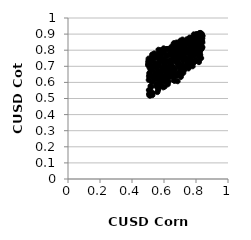
| Category | Series 0 |
|---|---|
| 0.789537141163253 | 0.803 |
| 0.7393209278989524 | 0.742 |
| 0.5146972384262045 | 0.66 |
| 0.8025821466182872 | 0.869 |
| 0.7553423103545773 | 0.871 |
| 0.6518374552992151 | 0.783 |
| 0.716653761533334 | 0.678 |
| 0.7913280189907017 | 0.766 |
| 0.5979593884945443 | 0.812 |
| 0.6924302068703907 | 0.796 |
| 0.6721062809417795 | 0.773 |
| 0.6343633907560136 | 0.633 |
| 0.7126194483507063 | 0.855 |
| 0.5954020792871302 | 0.569 |
| 0.7838053251334289 | 0.764 |
| 0.5831548302153797 | 0.656 |
| 0.6665365841519753 | 0.609 |
| 0.5408568572932027 | 0.663 |
| 0.7822607365205054 | 0.847 |
| 0.5972532858750963 | 0.71 |
| 0.5687135410672672 | 0.594 |
| 0.8086954234759687 | 0.868 |
| 0.6833786474103468 | 0.65 |
| 0.575823483311674 | 0.575 |
| 0.7512775900678096 | 0.84 |
| 0.5157013543859263 | 0.578 |
| 0.6257720732143637 | 0.684 |
| 0.6489855045192885 | 0.694 |
| 0.6496880024415178 | 0.791 |
| 0.643625241038317 | 0.712 |
| 0.8337201559222865 | 0.814 |
| 0.7409492055369735 | 0.717 |
| 0.6217054554742861 | 0.673 |
| 0.7963768174862137 | 0.882 |
| 0.7535535987557852 | 0.694 |
| 0.6586420130550489 | 0.633 |
| 0.807680028695077 | 0.88 |
| 0.7996050523855961 | 0.877 |
| 0.5791963725857388 | 0.661 |
| 0.7899514284050327 | 0.728 |
| 0.6170863241183342 | 0.805 |
| 0.696999464018413 | 0.647 |
| 0.8108554417359185 | 0.84 |
| 0.5592521472254736 | 0.54 |
| 0.673407103201527 | 0.727 |
| 0.6364854366401308 | 0.652 |
| 0.8019023742772847 | 0.867 |
| 0.7017172402778769 | 0.806 |
| 0.682590820111384 | 0.736 |
| 0.8255507794949901 | 0.764 |
| 0.7270235156668525 | 0.82 |
| 0.5835508032848437 | 0.691 |
| 0.5480344765651697 | 0.633 |
| 0.590976132361733 | 0.628 |
| 0.5080178996267478 | 0.52 |
| 0.5213319708328319 | 0.747 |
| 0.5585170846697625 | 0.758 |
| 0.727219435900885 | 0.829 |
| 0.8247338158405075 | 0.88 |
| 0.6407434502436964 | 0.705 |
| 0.7399629861713787 | 0.809 |
| 0.8203378696219645 | 0.829 |
| 0.5749204074095717 | 0.669 |
| 0.6471009726955761 | 0.823 |
| 0.5258403186809127 | 0.773 |
| 0.6884872854444603 | 0.807 |
| 0.7778725840772602 | 0.862 |
| 0.7719403527171453 | 0.839 |
| 0.7857166333493164 | 0.876 |
| 0.6579228734268394 | 0.775 |
| 0.7614068246514567 | 0.754 |
| 0.6230047715944955 | 0.724 |
| 0.7730864565297618 | 0.776 |
| 0.7591578467960547 | 0.826 |
| 0.6450855435140814 | 0.773 |
| 0.6286691533007386 | 0.604 |
| 0.747986817526133 | 0.739 |
| 0.7959635419356264 | 0.732 |
| 0.5195048153118826 | 0.572 |
| 0.5660370532559245 | 0.579 |
| 0.5093421625427896 | 0.646 |
| 0.7877308143223478 | 0.877 |
| 0.5674634064427115 | 0.619 |
| 0.5613703026136772 | 0.662 |
| 0.5719420304504657 | 0.754 |
| 0.5675779671727499 | 0.709 |
| 0.8322778754209412 | 0.804 |
| 0.5765796773158051 | 0.647 |
| 0.6253366417877969 | 0.64 |
| 0.7154265294037168 | 0.866 |
| 0.5016962133848333 | 0.726 |
| 0.7712719926138032 | 0.743 |
| 0.7572323442549609 | 0.836 |
| 0.8345911046278203 | 0.894 |
| 0.5860378547236758 | 0.749 |
| 0.8224486327946388 | 0.809 |
| 0.6418075506634328 | 0.793 |
| 0.724220812300675 | 0.77 |
| 0.6787454511188613 | 0.755 |
| 0.7333125306797498 | 0.742 |
| 0.5228472771427579 | 0.753 |
| 0.6760243627180262 | 0.785 |
| 0.543372627101915 | 0.713 |
| 0.7576616174536694 | 0.728 |
| 0.713827252726047 | 0.799 |
| 0.6300923187554525 | 0.676 |
| 0.7904861337532192 | 0.88 |
| 0.7247234132525657 | 0.677 |
| 0.6359512200970323 | 0.684 |
| 0.5555859263387691 | 0.62 |
| 0.6768518473513807 | 0.758 |
| 0.7632916115194517 | 0.711 |
| 0.8361713561107815 | 0.853 |
| 0.7186095118210329 | 0.851 |
| 0.7826198001580864 | 0.817 |
| 0.5738240237371401 | 0.766 |
| 0.522229076433828 | 0.731 |
| 0.7436753682812365 | 0.839 |
| 0.5694467603981398 | 0.573 |
| 0.5233217223801523 | 0.605 |
| 0.6055794496710558 | 0.636 |
| 0.8259875826886454 | 0.898 |
| 0.5546883763017978 | 0.685 |
| 0.6970743407092577 | 0.703 |
| 0.7566165155017609 | 0.864 |
| 0.7992659975486164 | 0.739 |
| 0.7196651382184569 | 0.804 |
| 0.8271957800808887 | 0.886 |
| 0.6426070367800769 | 0.669 |
| 0.6394822772287416 | 0.714 |
| 0.7626421155655152 | 0.719 |
| 0.734411382934531 | 0.781 |
| 0.5534244408105516 | 0.692 |
| 0.8281919239707146 | 0.866 |
| 0.7088443723876972 | 0.665 |
| 0.8199861684290868 | 0.84 |
| 0.6401429103923447 | 0.738 |
| 0.7025045353921959 | 0.751 |
| 0.746728014880554 | 0.712 |
| 0.7581663571935776 | 0.72 |
| 0.7507911358505414 | 0.706 |
| 0.6372755305705395 | 0.811 |
| 0.7173810607794494 | 0.734 |
| 0.7935086587236646 | 0.73 |
| 0.7149317985403314 | 0.667 |
| 0.6154269675054836 | 0.769 |
| 0.7361277163643768 | 0.808 |
| 0.6131144084233837 | 0.662 |
| 0.5302334103463762 | 0.674 |
| 0.6282488273001341 | 0.732 |
| 0.6099894606985351 | 0.771 |
| 0.5708010144974307 | 0.728 |
| 0.5125394888278862 | 0.71 |
| 0.7178824865773556 | 0.707 |
| 0.6449624632456418 | 0.654 |
| 0.677701555558522 | 0.848 |
| 0.7886346470031298 | 0.729 |
| 0.501015685375253 | 0.706 |
| 0.7659417452105861 | 0.744 |
| 0.8004567309422825 | 0.861 |
| 0.5043896243421815 | 0.615 |
| 0.7761600594016458 | 0.876 |
| 0.6982249758776872 | 0.706 |
| 0.7770443676625121 | 0.803 |
| 0.5823176648096522 | 0.648 |
| 0.5293232185321834 | 0.743 |
| 0.6623106509693579 | 0.779 |
| 0.8365377168351142 | 0.811 |
| 0.5500247197642468 | 0.63 |
| 0.8404298894487359 | 0.818 |
| 0.8302343059578688 | 0.831 |
| 0.7280562744120243 | 0.806 |
| 0.7052163806409246 | 0.633 |
| 0.5883584156752549 | 0.578 |
| 0.814812190026081 | 0.78 |
| 0.7849867627304555 | 0.787 |
| 0.5396863462382026 | 0.71 |
| 0.6609840372955875 | 0.843 |
| 0.7225769808817138 | 0.754 |
| 0.6615694642950851 | 0.737 |
| 0.7804333124404206 | 0.731 |
| 0.6707992627941833 | 0.827 |
| 0.5102409027126322 | 0.69 |
| 0.7690451302396976 | 0.875 |
| 0.7619484803774603 | 0.859 |
| 0.6378902395056195 | 0.727 |
| 0.5511583664545938 | 0.704 |
| 0.6271628713404449 | 0.657 |
| 0.7670833033895674 | 0.838 |
| 0.7300021073221883 | 0.797 |
| 0.6046075290501778 | 0.574 |
| 0.5702450708924186 | 0.754 |
| 0.5722356065049252 | 0.788 |
| 0.5134334107048619 | 0.517 |
| 0.5810489904550544 | 0.775 |
| 0.6384709155846835 | 0.801 |
| 0.6186296199921117 | 0.693 |
| 0.7832609581420303 | 0.874 |
| 0.7989352083779209 | 0.871 |
| 0.812688064621234 | 0.895 |
| 0.7650897692764829 | 0.739 |
| 0.6068793432318736 | 0.604 |
| 0.7498929052159753 | 0.836 |
| 0.6120349753517347 | 0.726 |
| 0.5169431667872195 | 0.531 |
| 0.5420872220308097 | 0.642 |
| 0.6235870093073029 | 0.808 |
| 0.5422605610858657 | 0.723 |
| 0.7260380441251993 | 0.855 |
| 0.7116958134653328 | 0.781 |
| 0.5077893646532936 | 0.658 |
| 0.767893875161042 | 0.812 |
| 0.650373331584239 | 0.776 |
| 0.598786939241255 | 0.726 |
| 0.695608895007974 | 0.786 |
| 0.82535017237486 | 0.791 |
| 0.5104788671468552 | 0.646 |
| 0.7320293709174297 | 0.827 |
| 0.6269588786217475 | 0.697 |
| 0.593083062892082 | 0.617 |
| 0.5350707556940748 | 0.625 |
| 0.6294453702593112 | 0.774 |
| 0.7040968136256662 | 0.7 |
| 0.6533779649164462 | 0.698 |
| 0.7942106823003154 | 0.826 |
| 0.811901963147115 | 0.895 |
| 0.7104740438861703 | 0.656 |
| 0.693133057427636 | 0.814 |
| 0.7921355056519706 | 0.812 |
| 0.6892237066591924 | 0.657 |
| 0.7004566094279603 | 0.832 |
| 0.5308072251341074 | 0.534 |
| 0.5878246704918391 | 0.791 |
| 0.7457421732222543 | 0.836 |
| 0.6875049544639892 | 0.779 |
| 0.6015842296174445 | 0.785 |
| 0.5610861855862372 | 0.642 |
| 0.5486175619525406 | 0.586 |
| 0.8307150512817066 | 0.839 |
| 0.7889646714209345 | 0.885 |
| 0.5898890208474401 | 0.672 |
| 0.7682190639148487 | 0.764 |
| 0.5206159518238059 | 0.743 |
| 0.5944197797454747 | 0.805 |
| 0.5769503188403247 | 0.668 |
| 0.5443798624577283 | 0.626 |
| 0.5387178807052888 | 0.78 |
| 0.6572891983003302 | 0.653 |
| 0.505137078765321 | 0.552 |
| 0.5024680753734336 | 0.735 |
| 0.7415167907407327 | 0.867 |
| 0.6914305278073793 | 0.654 |
| 0.534198398019456 | 0.758 |
| 0.6204361340329394 | 0.804 |
| 0.8288236153589748 | 0.835 |
| 0.7369203330463815 | 0.694 |
| 0.538099366126239 | 0.768 |
| 0.8011450774957143 | 0.859 |
| 0.8105242713615359 | 0.79 |
| 0.7292228330643074 | 0.76 |
| 0.8358139794247456 | 0.823 |
| 0.816563368010178 | 0.903 |
| 0.580207523896829 | 0.801 |
| 0.6316776881528324 | 0.674 |
| 0.5371866346769926 | 0.751 |
| 0.6687148511904183 | 0.804 |
| 0.6567939707349895 | 0.753 |
| 0.7209976358971026 | 0.659 |
| 0.7135983798827182 | 0.754 |
| 0.7696541728498524 | 0.848 |
| 0.7157272758945765 | 0.794 |
| 0.6172562919259493 | 0.807 |
| 0.5263219179213916 | 0.765 |
| 0.7813322103951235 | 0.83 |
| 0.8034618510051994 | 0.9 |
| 0.6135469142534808 | 0.762 |
| 0.7101028762311821 | 0.757 |
| 0.8082577811232756 | 0.838 |
| 0.7930110556401346 | 0.893 |
| 0.8315888311006657 | 0.816 |
| 0.5531132017462612 | 0.59 |
| 0.5640164770073358 | 0.748 |
| 0.740755864883649 | 0.842 |
| 0.8138927524118643 | 0.802 |
| 0.5965798767691801 | 0.78 |
| 0.6905536117521336 | 0.725 |
| 0.6989193945286931 | 0.693 |
| 0.6782873171751561 | 0.809 |
| 0.5887587360960318 | 0.69 |
| 0.545096536696138 | 0.764 |
| 0.5181168736858328 | 0.639 |
| 0.5563498425888556 | 0.571 |
| 0.7948384877299103 | 0.873 |
| 0.6485331080822354 | 0.735 |
| 0.707040865868648 | 0.647 |
| 0.6723104222854052 | 0.811 |
| 0.7308092922984819 | 0.793 |
| 0.5277218957704807 | 0.521 |
| 0.8299161022661221 | 0.895 |
| 0.5311810440695621 | 0.693 |
| 0.6162599047138804 | 0.807 |
| 0.7326922975353685 | 0.848 |
| 0.6812268205595059 | 0.647 |
| 0.6798712123164434 | 0.812 |
| 0.5184395433749904 | 0.571 |
| 0.820841176408082 | 0.758 |
| 0.8188985142541382 | 0.857 |
| 0.8396653941332525 | 0.873 |
| 0.8171376598364926 | 0.857 |
| 0.8132403407792173 | 0.875 |
| 0.7559537005015777 | 0.712 |
| 0.7064923509611757 | 0.682 |
| 0.6515978628646515 | 0.806 |
| 0.619877284833922 | 0.764 |
| 0.5116384102169871 | 0.522 |
| 0.5138558575832506 | 0.555 |
| 0.72195636492609 | 0.702 |
| 0.7983077541737953 | 0.782 |
| 0.8401326443252485 | 0.847 |
| 0.6021195898072189 | 0.748 |
| 0.5239760149762042 | 0.605 |
| 0.7722807887619956 | 0.794 |
| 0.7232868499769498 | 0.802 |
| 0.6240934413111874 | 0.588 |
| 0.5797529875715566 | 0.585 |
| 0.7337505091867687 | 0.823 |
| 0.5345826574834631 | 0.615 |
| 0.8231493107431219 | 0.831 |
| 0.760874810361585 | 0.76 |
| 0.7518745549436666 | 0.797 |
| 0.7037596612497005 | 0.842 |
| 0.8371061056063369 | 0.896 |
| 0.5005654408318474 | 0.713 |
| 0.6600261468371134 | 0.614 |
| 0.6655703554853698 | 0.662 |
| 0.6188464155712632 | 0.73 |
| 0.7213733608617222 | 0.833 |
| 0.8376254118775233 | 0.878 |
| 0.8290088863347889 | 0.863 |
| 0.6866084537307862 | 0.702 |
| 0.655859259045968 | 0.821 |
| 0.6028599353701174 | 0.691 |
| 0.5778004885046151 | 0.584 |
| 0.8149097894305937 | 0.798 |
| 0.5035709114777457 | 0.748 |
| 0.8070455716759641 | 0.79 |
| 0.8343825575344785 | 0.815 |
| 0.6803238877647404 | 0.76 |
| 0.7595134728547416 | 0.879 |
| 0.550274464401461 | 0.711 |
| 0.6217501567726843 | 0.613 |
| 0.6461457087190123 | 0.711 |
| 0.6348514102882601 | 0.771 |
| 0.6084930386406241 | 0.708 |
| 0.8192868320233158 | 0.738 |
| 0.7783480602052675 | 0.719 |
| 0.6113945756898719 | 0.679 |
| 0.6943933388688436 | 0.849 |
| 0.6529179606617319 | 0.682 |
| 0.6056979474012236 | 0.644 |
| 0.6848714705276597 | 0.736 |
| 0.8015582336093101 | 0.899 |
| 0.7289067495823759 | 0.816 |
| 0.5622284064939066 | 0.582 |
| 0.7702812009293001 | 0.779 |
| 0.8033983214234028 | 0.847 |
| 0.6107656759838829 | 0.632 |
| 0.7057501357201889 | 0.798 |
| 0.5645974943306735 | 0.781 |
| 0.7491960113879528 | 0.719 |
| 0.6917449551751924 | 0.833 |
| 0.8276715674720829 | 0.907 |
| 0.764799815398711 | 0.716 |
| 0.6433917746198824 | 0.681 |
| 0.8325839292006654 | 0.751 |
| 0.5957830175324024 | 0.607 |
| 0.6755465129170561 | 0.785 |
| 0.7862526788101084 | 0.899 |
| 0.8055068218552915 | 0.788 |
| 0.5934660374426435 | 0.744 |
| 0.7796131888918132 | 0.875 |
| 0.6744980171013388 | 0.745 |
| 0.6682844089184725 | 0.633 |
| 0.8040624721982079 | 0.78 |
| 0.5730330248982907 | 0.727 |
| 0.663483374175547 | 0.812 |
| 0.8221742857258698 | 0.778 |
| 0.5476056374957843 | 0.714 |
| 0.7754581525567357 | 0.863 |
| 0.8392207373883781 | 0.891 |
| 0.8094765911449644 | 0.793 |
| 0.5922345049980708 | 0.667 |
| 0.6474579633067048 | 0.639 |
| 0.7768302206504119 | 0.88 |
| 0.7544998921006918 | 0.778 |
| 0.786887759064523 | 0.725 |
| 0.7640462771385799 | 0.785 |
| 0.5165512430964073 | 0.671 |
| 0.5360847798916163 | 0.704 |
| 0.7807273047009422 | 0.728 |
| 0.7749783103177902 | 0.781 |
| 0.8331184289387845 | 0.86 |
| 0.6549505387521527 | 0.697 |
| 0.8350421778859363 | 0.903 |
| 0.6859579806184146 | 0.75 |
| 0.7663724314223361 | 0.712 |
| 0.8177862941701423 | 0.76 |
| 0.7540287822068092 | 0.81 |
| 0.7200405575950605 | 0.741 |
| 0.667676076606502 | 0.829 |
| 0.552387216111887 | 0.663 |
| 0.7442838691388534 | 0.846 |
| 0.604081285321407 | 0.721 |
| 0.608928945576837 | 0.697 |
| 0.7385924061333593 | 0.74 |
| 0.8238578367821685 | 0.808 |
| 0.7255112937219836 | 0.677 |
| 0.792575670625725 | 0.737 |
| 0.821348189171077 | 0.856 |
| 0.6649120072510374 | 0.842 |
| 0.8046421024533167 | 0.808 |
| 0.5065103618331985 | 0.529 |
| 0.6960898931023682 | 0.814 |
| 0.7474115934583401 | 0.724 |
| 0.5467928323819594 | 0.754 |
| 0.6818868608789497 | 0.642 |
| 0.5253352901702142 | 0.699 |
| 0.773883473217598 | 0.73 |
| 0.7603668213685014 | 0.856 |
| 0.7967468101681756 | 0.828 |
| 0.6705602813345477 | 0.799 |
| 0.6309182357433218 | 0.648 |
| 0.8310479566002458 | 0.818 |
| 0.6325658895445669 | 0.678 |
| 0.8266888472407585 | 0.771 |
| 0.7006261887138281 | 0.67 |
| 0.7842778855332349 | 0.842 |
| 0.6659732911961607 | 0.672 |
| 0.6693854136913613 | 0.683 |
| 0.6994968517177692 | 0.713 |
| 0.7978472162532757 | 0.839 |
| 0.7374869270186959 | 0.856 |
| 0.8164663854506397 | 0.795 |
| 0.6896129679642443 | 0.8 |
| 0.5579749556458715 | 0.572 |
| 0.8056581221452149 | 0.779 |
| 0.7873914650139319 | 0.859 |
| 0.7793454863912508 | 0.7 |
| 0.6334950040387688 | 0.695 |
| 0.5320665774426665 | 0.625 |
| 0.5597604347093685 | 0.704 |
| 0.6936607614974919 | 0.765 |
| 0.5058655571533703 | 0.637 |
| 0.7493934186874354 | 0.729 |
| 0.8387690499716574 | 0.857 |
| 0.5840419248153067 | 0.767 |
| 0.8157624935827636 | 0.815 |
| 0.6541272166461876 | 0.788 |
| 0.6641038199385962 | 0.777 |
| 0.7744218546165372 | 0.815 |
| 0.7030388593112695 | 0.86 |
| 0.5402943534428464 | 0.65 |
| 0.607506174513098 | 0.617 |
| 0.6140948824893664 | 0.68 |
| 0.6853888022552872 | 0.607 |
| 0.5328351599906361 | 0.756 |
| 0.8410056060395921 | 0.889 |
| 0.7353356687600429 | 0.788 |
| 0.7428454406025613 | 0.811 |
| 0.6003997663573484 | 0.626 |
| 0.5864733424346917 | 0.634 |
| 0.8184514977683318 | 0.726 |
| 0.6594015734738186 | 0.791 |
| 0.8234092256734673 | 0.907 |
| 0.746220387298123 | 0.807 |
| 0.744791945930634 | 0.807 |
| 0.6002483614717703 | 0.623 |
| 0.7085156453134214 | 0.815 |
| 0.6839079493313234 | 0.721 |
| 0.7706952622317517 | 0.833 |
| 0.5281190398108249 | 0.692 |
| 0.5570222706826367 | 0.701 |
| 0.5653082994213927 | 0.803 |
| 0.5460084718126278 | 0.631 |
| 0.7317011980613475 | 0.828 |
| 0.7076990167473598 | 0.831 |
| 0.8114551726119582 | 0.79 |
| 0.7422622255618085 | 0.747 |
| 0.7382118330031835 | 0.693 |
| 0.7111180119437281 | 0.784 |
| 0.8062313878890663 | 0.847 |
| 0.674135390663121 | 0.753 |
| 0.8096214170149771 | 0.831 |
| 0.5852921103066097 | 0.606 |
| 0.5906997642665537 | 0.734 |
| 0.8381530388490658 | 0.88 |
| 0.7528427078964053 | 0.686 |
| 0.8133816512580974 | 0.888 |
| 0.7954787818687489 | 0.889 |
| 0.5634001675840955 | 0.553 |